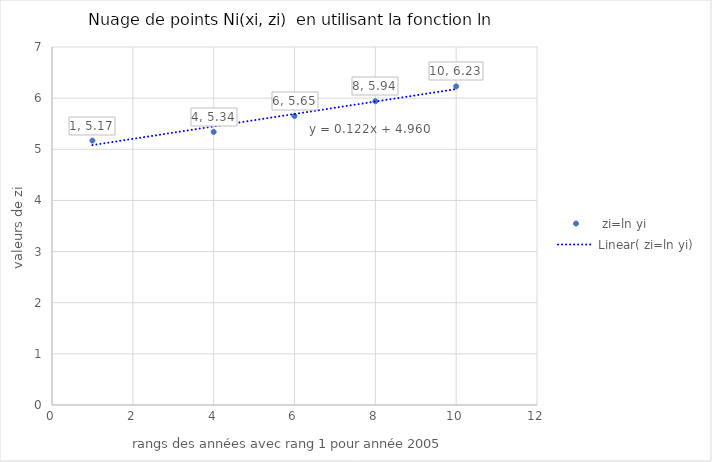
| Category |  zi=ln yi |
|---|---|
| 1.0 | 5.17 |
| 4.0 | 5.34 |
| 6.0 | 5.65 |
| 8.0 | 5.94 |
| 10.0 | 6.23 |